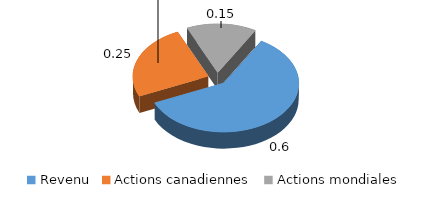
| Category | Series 0 |
|---|---|
| Revenu | 0.6 |
| Actions canadiennes | 0.25 |
| Actions mondiales | 0.15 |